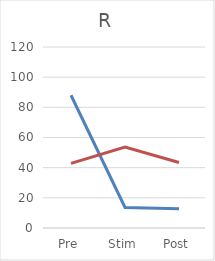
| Category | Series 0 | Series 1 |
|---|---|---|
| Pre | 88 | 42.857 |
| Stim | 13.6 | 53.714 |
| Post | 12.8 | 43.429 |